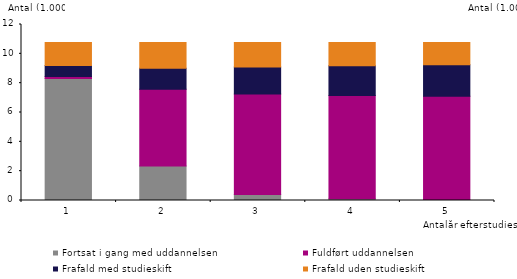
| Category | Fortsat i gang med uddannelsen | Fuldført uddannelsen | Frafald med studieskift | Frafald uden studieskift |
|---|---|---|---|---|
| 1.0 | 8317 | 140 | 746 | 1572 |
| 2.0 | 2349 | 5232 | 1434 | 1760 |
| 3.0 | 407 | 6852 | 1851 | 1665 |
| 4.0 | 121 | 7033 | 2041 | 1580 |
| 5.0 | 43 | 7070 | 2137 | 1525 |